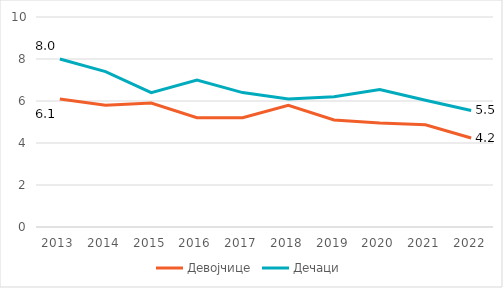
| Category | Девојчице | Дечаци |
|---|---|---|
| 2013.0 | 6.1 | 8 |
| 2014.0 | 5.8 | 7.4 |
| 2015.0 | 5.9 | 6.4 |
| 2016.0 | 5.2 | 7 |
| 2017.0 | 5.2 | 6.4 |
| 2018.0 | 5.8 | 6.1 |
| 2019.0 | 5.1 | 6.2 |
| 2020.0 | 4.948 | 6.544 |
| 2021.0 | 4.866 | 6.037 |
| 2022.0 | 4.239 | 5.548 |